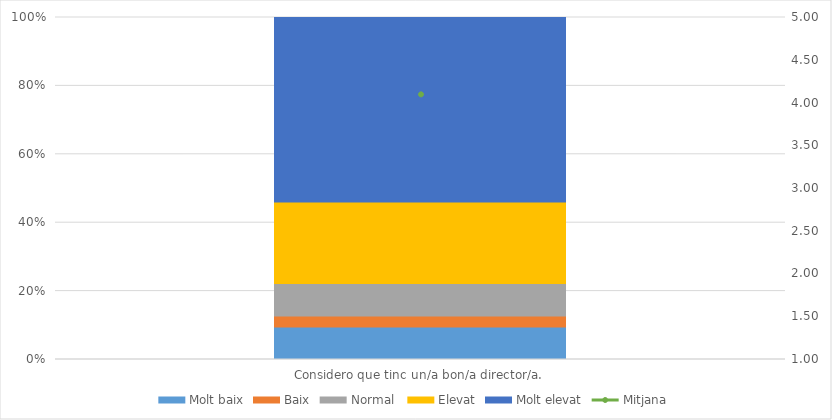
| Category | Molt baix | Baix | Normal  | Elevat | Molt elevat |
|---|---|---|---|---|---|
| Considero que tinc un/a bon/a director/a. | 6 | 2 | 6 | 15 | 34 |